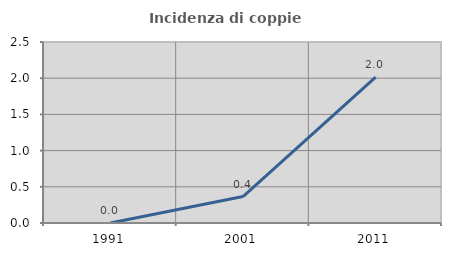
| Category | Incidenza di coppie miste |
|---|---|
| 1991.0 | 0 |
| 2001.0 | 0.365 |
| 2011.0 | 2.013 |